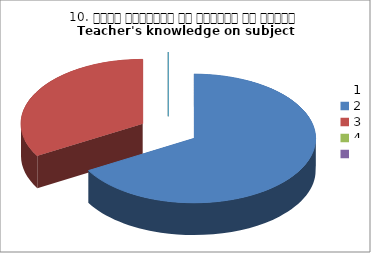
| Category | 10. विषय अवधारणा पर शिक्षक का ज्ञान
Teacher's knowledge on subject concept?
 |
|---|---|
| 0 | 2 |
| 1 | 1 |
| 2 | 0 |
| 3 | 0 |
| 4 | 0 |